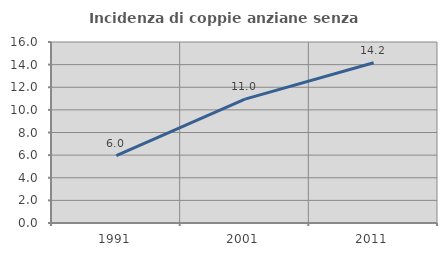
| Category | Incidenza di coppie anziane senza figli  |
|---|---|
| 1991.0 | 5.956 |
| 2001.0 | 10.954 |
| 2011.0 | 14.171 |